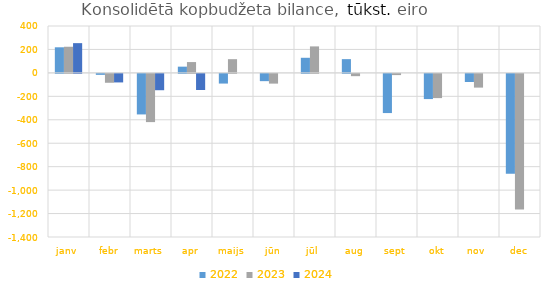
| Category | 2022 | 2023 | 2024 |
|---|---|---|---|
| janv | 218389.091 | 223039.368 | 253732.151 |
| febr | -8203.95 | -75727.525 | -72861.155 |
| marts | -345869.737 | -411380.469 | -139295.222 |
| apr | 53138.837 | 92355.55 | -137655.898 |
| maijs | -82553.768 | 116986.885 | 0 |
| jūn | -61976.694 | -83017.071 | 0 |
| jūl | 128860.015 | 225991.399 | 0 |
| aug | 117341.161 | -19435.504 | 0 |
| sept | -334219.509 | -10334.49 | 0 |
| okt | -214870.466 | -206638.491 | 0 |
| nov | -69420.277 | -117014.401 | 0 |
| dec | -851302.945 | -1157739.041 | 0 |